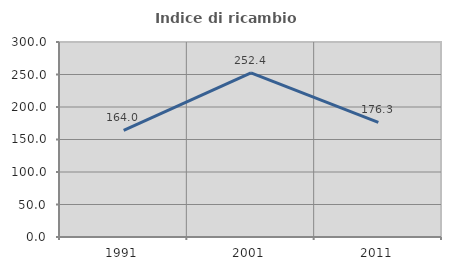
| Category | Indice di ricambio occupazionale  |
|---|---|
| 1991.0 | 164 |
| 2001.0 | 252.381 |
| 2011.0 | 176.316 |